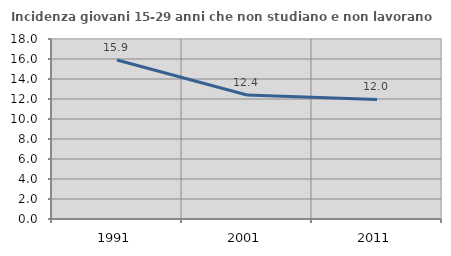
| Category | Incidenza giovani 15-29 anni che non studiano e non lavorano  |
|---|---|
| 1991.0 | 15.896 |
| 2001.0 | 12.397 |
| 2011.0 | 11.957 |